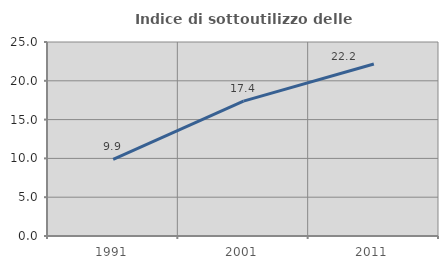
| Category | Indice di sottoutilizzo delle abitazioni  |
|---|---|
| 1991.0 | 9.882 |
| 2001.0 | 17.374 |
| 2011.0 | 22.165 |